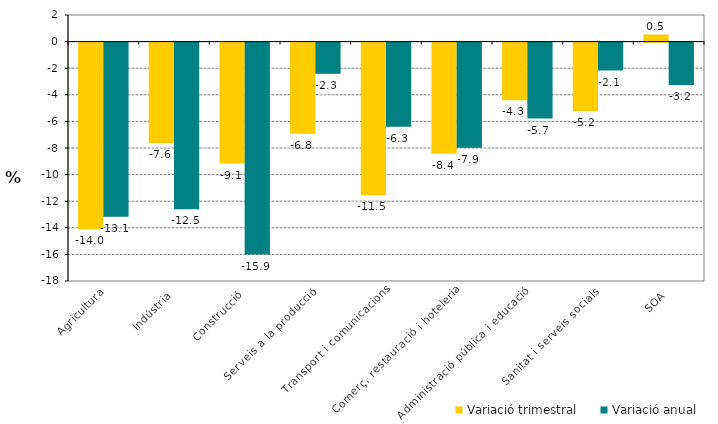
| Category | Variació trimestral | Variació anual |
|---|---|---|
| Agricultura | -14.029 | -13.091 |
| Indústria | -7.558 | -12.526 |
| Construcció | -9.099 | -15.942 |
| Serveis a la producció | -6.849 | -2.345 |
| Transport i comunicacions | -11.484 | -6.335 |
| Comerç, restauració i hoteleria | -8.355 | -7.908 |
| Administració pública i educació | -4.333 | -5.707 |
| Sanitat i serveis socials | -5.16 | -2.098 |
| SOA | 0.534 | -3.189 |